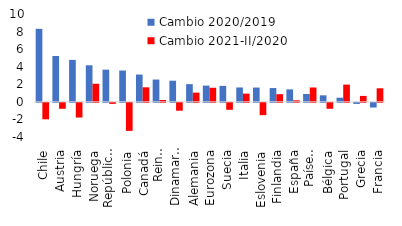
| Category | Cambio 2020/2019 |  Cambio 2021-II/2020  |
|---|---|---|
| Chile | 8.314 | -1.872 |
| Austria | 5.22 | -0.675 |
| Hungría | 4.777 | -1.669 |
| Noruega | 4.164 | 2.062 |
| República checa | 3.665 | -0.115 |
| Polonia | 3.566 | -3.191 |
| Canadá | 3.107 | 1.657 |
| Reino unido | 2.538 | 0.209 |
| Dinamarca | 2.407 | -0.895 |
| Alemania | 2.016 | 1.05 |
| Eurozona | 1.848 | 1.603 |
| Suecia | 1.818 | -0.789 |
| Italia | 1.639 | 0.935 |
| Eslovenia | 1.627 | -1.402 |
| Finlandia | 1.571 | 0.869 |
| España | 1.418 | 0.176 |
| Países bajos | 0.897 | 1.635 |
| Bélgica | 0.742 | -0.677 |
| Portugal | 0.473 | 1.964 |
| Grecia | -0.119 | 0.676 |
| Francia | -0.531 | 1.543 |